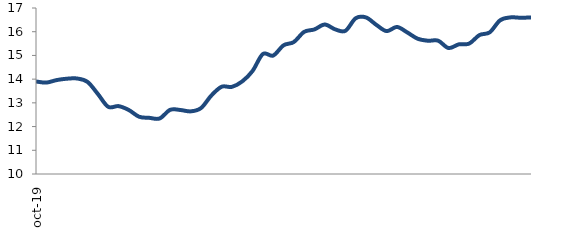
| Category | Series 0 |
|---|---|
| 2019-10-01 | 13.901 |
| 2019-11-01 | 13.855 |
| 2019-12-01 | 13.96 |
| 2020-01-01 | 14.019 |
| 2020-02-01 | 14.026 |
| 2020-03-01 | 13.882 |
| 2020-04-01 | 13.374 |
| 2020-05-01 | 12.833 |
| 2020-06-01 | 12.862 |
| 2020-07-01 | 12.698 |
| 2020-08-01 | 12.414 |
| 2020-09-01 | 12.367 |
| 2020-10-01 | 12.342 |
| 2020-11-01 | 12.705 |
| 2020-12-01 | 12.699 |
| 2021-01-01 | 12.641 |
| 2021-02-01 | 12.779 |
| 2021-03-01 | 13.308 |
| 2021-04-01 | 13.679 |
| 2021-05-01 | 13.675 |
| 2021-06-01 | 13.905 |
| 2021-07-01 | 14.345 |
| 2021-08-01 | 15.059 |
| 2021-09-01 | 14.995 |
| 2021-10-01 | 15.427 |
| 2021-11-01 | 15.564 |
| 2021-12-01 | 15.993 |
| 2022-01-01 | 16.097 |
| 2022-02-01 | 16.304 |
| 2022-03-01 | 16.101 |
| 2022-04-01 | 16.037 |
| 2022-05-01 | 16.568 |
| 2022-06-01 | 16.602 |
| 2022-07-01 | 16.29 |
| 2022-08-01 | 16.026 |
| 2022-09-01 | 16.201 |
| 2022-10-01 | 15.97 |
| 2022-11-01 | 15.706 |
| 2022-12-01 | 15.62 |
| 2023-01-01 | 15.621 |
| 2023-02-01 | 15.312 |
| 2023-03-01 | 15.467 |
| 2023-04-01 | 15.498 |
| 2023-05-01 | 15.858 |
| 2023-06-01 | 15.975 |
| 2023-07-01 | 16.48 |
| 2023-08-01 | 16.604 |
| 2023-09-01 | 16.589 |
| 2023-10-01 | 16.601 |